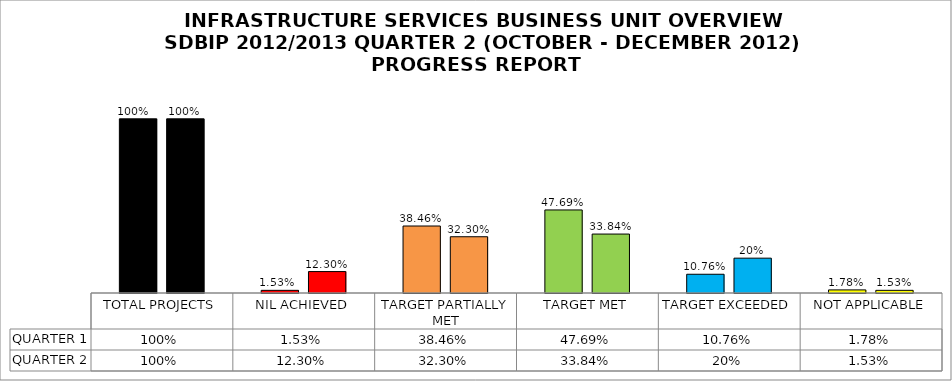
| Category | QUARTER 1 | QUARTER 2 |
|---|---|---|
| TOTAL PROJECTS | 1 | 1 |
| NIL ACHIEVED | 0.015 | 0.123 |
| TARGET PARTIALLY MET | 0.385 | 0.323 |
| TARGET MET | 0.477 | 0.338 |
| TARGET EXCEEDED | 0.108 | 0.2 |
| NOT APPLICABLE | 0.018 | 0.015 |